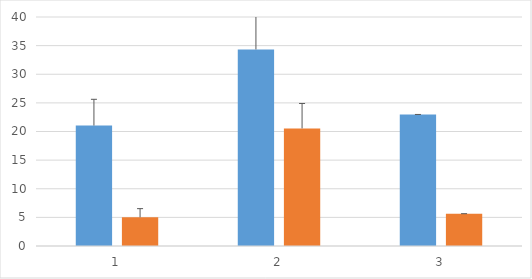
| Category | Teta 1 | Teta 2 |
|---|---|---|
| 0 | 21.036 | 5.007 |
| 1 | 34.335 | 20.542 |
| 2 | 22.977 | 5.645 |